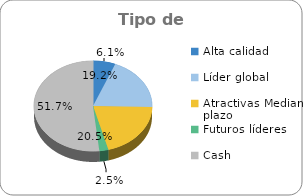
| Category | Series 0 |
|---|---|
| Alta calidad | 0.061 |
| Líder global | 0.192 |
| Atractivas Mediano plazo | 0.205 |
| Futuros líderes | 0.025 |
| Cash | 0.517 |